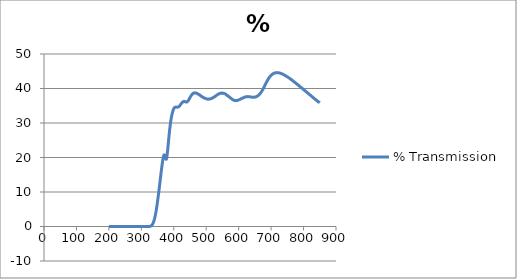
| Category | % Transmission |
|---|---|
| 850.0 | 35.874 |
| 849.0 | 35.95 |
| 848.0 | 35.981 |
| 847.0 | 36.086 |
| 846.0 | 36.12 |
| 845.0 | 36.175 |
| 844.0 | 36.282 |
| 843.0 | 36.315 |
| 842.0 | 36.426 |
| 841.0 | 36.486 |
| 840.0 | 36.576 |
| 839.0 | 36.654 |
| 838.0 | 36.695 |
| 837.0 | 36.776 |
| 836.0 | 36.86 |
| 835.0 | 36.948 |
| 834.0 | 37.019 |
| 833.0 | 37.098 |
| 832.0 | 37.189 |
| 831.0 | 37.23 |
| 830.0 | 37.332 |
| 829.0 | 37.418 |
| 828.0 | 37.479 |
| 827.0 | 37.564 |
| 826.0 | 37.66 |
| 825.0 | 37.74 |
| 824.0 | 37.8 |
| 823.0 | 37.884 |
| 822.0 | 37.952 |
| 821.0 | 38.055 |
| 820.0 | 38.13 |
| 819.0 | 38.192 |
| 818.0 | 38.271 |
| 817.0 | 38.362 |
| 816.0 | 38.419 |
| 815.0 | 38.524 |
| 814.0 | 38.585 |
| 813.0 | 38.67 |
| 812.0 | 38.768 |
| 811.0 | 38.841 |
| 810.0 | 38.909 |
| 809.0 | 39.001 |
| 808.0 | 39.061 |
| 807.0 | 39.157 |
| 806.0 | 39.238 |
| 805.0 | 39.308 |
| 804.0 | 39.382 |
| 803.0 | 39.464 |
| 802.0 | 39.53 |
| 801.0 | 39.63 |
| 800.0 | 39.699 |
| 799.0 | 39.766 |
| 798.0 | 39.854 |
| 797.0 | 39.945 |
| 796.0 | 40.009 |
| 795.0 | 40.087 |
| 794.0 | 40.174 |
| 793.0 | 40.233 |
| 792.0 | 40.318 |
| 791.0 | 40.411 |
| 790.0 | 40.484 |
| 789.0 | 40.574 |
| 788.0 | 40.641 |
| 787.0 | 40.722 |
| 786.0 | 40.805 |
| 785.0 | 40.902 |
| 784.0 | 40.947 |
| 783.0 | 41.051 |
| 782.0 | 41.102 |
| 781.0 | 41.165 |
| 780.0 | 41.261 |
| 779.0 | 41.338 |
| 778.0 | 41.39 |
| 777.0 | 41.478 |
| 776.0 | 41.555 |
| 775.0 | 41.637 |
| 774.0 | 41.717 |
| 773.0 | 41.801 |
| 772.0 | 41.861 |
| 771.0 | 41.934 |
| 770.0 | 42.011 |
| 769.0 | 42.068 |
| 768.0 | 42.154 |
| 767.0 | 42.25 |
| 766.0 | 42.311 |
| 765.0 | 42.392 |
| 764.0 | 42.456 |
| 763.0 | 42.514 |
| 762.0 | 42.607 |
| 761.0 | 42.675 |
| 760.0 | 42.717 |
| 759.0 | 42.796 |
| 758.0 | 42.876 |
| 757.0 | 42.935 |
| 756.0 | 43.003 |
| 755.0 | 43.088 |
| 754.0 | 43.14 |
| 753.0 | 43.21 |
| 752.0 | 43.266 |
| 751.0 | 43.323 |
| 750.0 | 43.392 |
| 749.0 | 43.445 |
| 748.0 | 43.489 |
| 747.0 | 43.57 |
| 746.0 | 43.613 |
| 745.0 | 43.669 |
| 744.0 | 43.739 |
| 743.0 | 43.798 |
| 742.0 | 43.831 |
| 741.0 | 43.902 |
| 740.0 | 43.94 |
| 739.0 | 43.985 |
| 738.0 | 44.049 |
| 737.0 | 44.095 |
| 736.0 | 44.122 |
| 735.0 | 44.183 |
| 734.0 | 44.227 |
| 733.0 | 44.26 |
| 732.0 | 44.301 |
| 731.0 | 44.333 |
| 730.0 | 44.358 |
| 729.0 | 44.408 |
| 728.0 | 44.44 |
| 727.0 | 44.469 |
| 726.0 | 44.494 |
| 725.0 | 44.53 |
| 724.0 | 44.528 |
| 723.0 | 44.559 |
| 722.0 | 44.575 |
| 721.0 | 44.567 |
| 720.0 | 44.579 |
| 719.0 | 44.578 |
| 718.0 | 44.581 |
| 717.0 | 44.59 |
| 716.0 | 44.599 |
| 715.0 | 44.571 |
| 714.0 | 44.567 |
| 713.0 | 44.536 |
| 712.0 | 44.517 |
| 711.0 | 44.492 |
| 710.0 | 44.474 |
| 709.0 | 44.431 |
| 708.0 | 44.381 |
| 707.0 | 44.329 |
| 706.0 | 44.258 |
| 705.0 | 44.225 |
| 704.0 | 44.155 |
| 703.0 | 44.074 |
| 702.0 | 44.008 |
| 701.0 | 43.913 |
| 700.0 | 43.823 |
| 699.0 | 43.741 |
| 698.0 | 43.64 |
| 697.0 | 43.533 |
| 696.0 | 43.415 |
| 695.0 | 43.291 |
| 694.0 | 43.146 |
| 693.0 | 43.017 |
| 692.0 | 42.863 |
| 691.0 | 42.691 |
| 690.0 | 42.554 |
| 689.0 | 42.387 |
| 688.0 | 42.214 |
| 687.0 | 42.028 |
| 686.0 | 41.874 |
| 685.0 | 41.71 |
| 684.0 | 41.513 |
| 683.0 | 41.329 |
| 682.0 | 41.122 |
| 681.0 | 40.927 |
| 680.0 | 40.754 |
| 679.0 | 40.573 |
| 678.0 | 40.368 |
| 677.0 | 40.19 |
| 676.0 | 39.995 |
| 675.0 | 39.812 |
| 674.0 | 39.656 |
| 673.0 | 39.501 |
| 672.0 | 39.333 |
| 671.0 | 39.174 |
| 670.0 | 39.02 |
| 669.0 | 38.882 |
| 668.0 | 38.774 |
| 667.0 | 38.635 |
| 666.0 | 38.509 |
| 665.0 | 38.403 |
| 664.0 | 38.286 |
| 663.0 | 38.194 |
| 662.0 | 38.122 |
| 661.0 | 38.045 |
| 660.0 | 37.965 |
| 659.0 | 37.905 |
| 658.0 | 37.829 |
| 657.0 | 37.764 |
| 656.0 | 37.724 |
| 655.0 | 37.673 |
| 654.0 | 37.621 |
| 653.0 | 37.59 |
| 652.0 | 37.558 |
| 651.0 | 37.534 |
| 650.0 | 37.529 |
| 649.0 | 37.508 |
| 648.0 | 37.484 |
| 647.0 | 37.481 |
| 646.0 | 37.47 |
| 645.0 | 37.473 |
| 644.0 | 37.488 |
| 643.0 | 37.486 |
| 642.0 | 37.473 |
| 641.0 | 37.494 |
| 640.0 | 37.506 |
| 639.0 | 37.528 |
| 638.0 | 37.56 |
| 637.0 | 37.556 |
| 636.0 | 37.561 |
| 635.0 | 37.581 |
| 634.0 | 37.584 |
| 633.0 | 37.596 |
| 632.0 | 37.624 |
| 631.0 | 37.635 |
| 630.0 | 37.64 |
| 629.0 | 37.646 |
| 628.0 | 37.636 |
| 627.0 | 37.639 |
| 626.0 | 37.65 |
| 625.0 | 37.629 |
| 624.0 | 37.614 |
| 623.0 | 37.605 |
| 622.0 | 37.575 |
| 621.0 | 37.558 |
| 620.0 | 37.541 |
| 619.0 | 37.505 |
| 618.0 | 37.465 |
| 617.0 | 37.435 |
| 616.0 | 37.381 |
| 615.0 | 37.341 |
| 614.0 | 37.306 |
| 613.0 | 37.257 |
| 612.0 | 37.212 |
| 611.0 | 37.175 |
| 610.0 | 37.121 |
| 609.0 | 37.064 |
| 608.0 | 37.035 |
| 607.0 | 36.989 |
| 606.0 | 36.936 |
| 605.0 | 36.889 |
| 604.0 | 36.836 |
| 603.0 | 36.795 |
| 602.0 | 36.776 |
| 601.0 | 36.724 |
| 600.0 | 36.683 |
| 599.0 | 36.646 |
| 598.0 | 36.605 |
| 597.0 | 36.584 |
| 596.0 | 36.557 |
| 595.0 | 36.523 |
| 594.0 | 36.504 |
| 593.0 | 36.493 |
| 592.0 | 36.485 |
| 591.0 | 36.477 |
| 590.0 | 36.508 |
| 589.0 | 36.507 |
| 588.0 | 36.517 |
| 587.0 | 36.556 |
| 586.0 | 36.572 |
| 585.0 | 36.622 |
| 584.0 | 36.669 |
| 583.0 | 36.704 |
| 582.0 | 36.759 |
| 581.0 | 36.821 |
| 580.0 | 36.879 |
| 579.0 | 36.95 |
| 578.0 | 37.03 |
| 577.0 | 37.087 |
| 576.0 | 37.165 |
| 575.0 | 37.242 |
| 574.0 | 37.315 |
| 573.0 | 37.39 |
| 572.0 | 37.477 |
| 571.0 | 37.546 |
| 570.0 | 37.609 |
| 569.0 | 37.698 |
| 568.0 | 37.768 |
| 567.0 | 37.84 |
| 566.0 | 37.936 |
| 565.0 | 37.984 |
| 564.0 | 38.059 |
| 563.0 | 38.128 |
| 562.0 | 38.171 |
| 561.0 | 38.286 |
| 560.0 | 38.331 |
| 559.0 | 38.395 |
| 558.0 | 38.456 |
| 557.0 | 38.492 |
| 556.0 | 38.534 |
| 555.0 | 38.56 |
| 554.0 | 38.572 |
| 553.0 | 38.608 |
| 552.0 | 38.635 |
| 551.0 | 38.639 |
| 550.0 | 38.657 |
| 549.0 | 38.669 |
| 548.0 | 38.651 |
| 547.0 | 38.647 |
| 546.0 | 38.671 |
| 545.0 | 38.626 |
| 544.0 | 38.609 |
| 543.0 | 38.586 |
| 542.0 | 38.525 |
| 541.0 | 38.512 |
| 540.0 | 38.482 |
| 539.0 | 38.444 |
| 538.0 | 38.391 |
| 537.0 | 38.341 |
| 536.0 | 38.275 |
| 535.0 | 38.216 |
| 534.0 | 38.172 |
| 533.0 | 38.109 |
| 532.0 | 38.037 |
| 531.0 | 37.968 |
| 530.0 | 37.886 |
| 529.0 | 37.811 |
| 528.0 | 37.782 |
| 527.0 | 37.69 |
| 526.0 | 37.643 |
| 525.0 | 37.573 |
| 524.0 | 37.492 |
| 523.0 | 37.45 |
| 522.0 | 37.401 |
| 521.0 | 37.345 |
| 520.0 | 37.289 |
| 519.0 | 37.253 |
| 518.0 | 37.181 |
| 517.0 | 37.153 |
| 516.0 | 37.124 |
| 515.0 | 37.069 |
| 514.0 | 37.051 |
| 513.0 | 37.004 |
| 512.0 | 36.975 |
| 511.0 | 36.943 |
| 510.0 | 36.964 |
| 509.0 | 36.932 |
| 508.0 | 36.926 |
| 507.0 | 36.911 |
| 506.0 | 36.906 |
| 505.0 | 36.95 |
| 504.0 | 36.976 |
| 503.0 | 36.941 |
| 502.0 | 36.976 |
| 501.0 | 36.987 |
| 500.0 | 37.005 |
| 499.0 | 37.047 |
| 498.0 | 37.118 |
| 497.0 | 37.126 |
| 496.0 | 37.185 |
| 495.0 | 37.218 |
| 494.0 | 37.232 |
| 493.0 | 37.305 |
| 492.0 | 37.358 |
| 491.0 | 37.394 |
| 490.0 | 37.468 |
| 489.0 | 37.502 |
| 488.0 | 37.56 |
| 487.0 | 37.628 |
| 486.0 | 37.702 |
| 485.0 | 37.745 |
| 484.0 | 37.826 |
| 483.0 | 37.88 |
| 482.0 | 37.947 |
| 481.0 | 38 |
| 480.0 | 38.108 |
| 479.0 | 38.143 |
| 478.0 | 38.214 |
| 477.0 | 38.291 |
| 476.0 | 38.297 |
| 475.0 | 38.38 |
| 474.0 | 38.447 |
| 473.0 | 38.496 |
| 472.0 | 38.544 |
| 471.0 | 38.574 |
| 470.0 | 38.605 |
| 469.0 | 38.648 |
| 468.0 | 38.709 |
| 467.0 | 38.69 |
| 466.0 | 38.736 |
| 465.0 | 38.716 |
| 464.0 | 38.699 |
| 463.0 | 38.706 |
| 462.0 | 38.7 |
| 461.0 | 38.658 |
| 460.0 | 38.588 |
| 459.0 | 38.557 |
| 458.0 | 38.432 |
| 457.0 | 38.362 |
| 456.0 | 38.266 |
| 455.0 | 38.125 |
| 454.0 | 38.006 |
| 453.0 | 37.865 |
| 452.0 | 37.693 |
| 451.0 | 37.544 |
| 450.0 | 37.385 |
| 449.0 | 37.213 |
| 448.0 | 37.021 |
| 447.0 | 36.874 |
| 446.0 | 36.666 |
| 445.0 | 36.544 |
| 444.0 | 36.408 |
| 443.0 | 36.297 |
| 442.0 | 36.195 |
| 441.0 | 36.13 |
| 440.0 | 36.072 |
| 439.0 | 36.051 |
| 438.0 | 36.099 |
| 437.0 | 36.088 |
| 436.0 | 36.157 |
| 435.0 | 36.181 |
| 434.0 | 36.215 |
| 433.0 | 36.252 |
| 432.0 | 36.28 |
| 431.0 | 36.225 |
| 430.0 | 36.232 |
| 429.0 | 36.188 |
| 428.0 | 36.106 |
| 427.0 | 36.04 |
| 426.0 | 35.958 |
| 425.0 | 35.826 |
| 424.0 | 35.717 |
| 423.0 | 35.601 |
| 422.0 | 35.459 |
| 421.0 | 35.35 |
| 420.0 | 35.225 |
| 419.0 | 35.098 |
| 418.0 | 34.976 |
| 417.0 | 34.883 |
| 416.0 | 34.789 |
| 415.0 | 34.712 |
| 414.0 | 34.688 |
| 413.0 | 34.606 |
| 412.0 | 34.591 |
| 411.0 | 34.582 |
| 410.0 | 34.56 |
| 409.0 | 34.6 |
| 408.0 | 34.606 |
| 407.0 | 34.612 |
| 406.0 | 34.604 |
| 405.0 | 34.594 |
| 404.0 | 34.571 |
| 403.0 | 34.521 |
| 402.0 | 34.45 |
| 401.0 | 34.303 |
| 400.0 | 34.153 |
| 399.0 | 33.955 |
| 398.0 | 33.691 |
| 397.0 | 33.41 |
| 396.0 | 33.083 |
| 395.0 | 32.682 |
| 394.0 | 32.27 |
| 393.0 | 31.797 |
| 392.0 | 31.281 |
| 391.0 | 30.707 |
| 390.0 | 30.067 |
| 389.0 | 29.356 |
| 388.0 | 28.584 |
| 387.0 | 27.758 |
| 386.0 | 26.849 |
| 385.0 | 25.924 |
| 384.0 | 24.956 |
| 383.0 | 23.953 |
| 382.0 | 22.978 |
| 381.0 | 22.021 |
| 380.0 | 21.16 |
| 379.0 | 20.416 |
| 378.0 | 19.801 |
| 377.0 | 19.534 |
| 376.0 | 19.514 |
| 375.0 | 19.7 |
| 374.0 | 20.006 |
| 373.0 | 20.344 |
| 372.0 | 20.611 |
| 371.0 | 20.747 |
| 370.0 | 20.725 |
| 369.0 | 20.535 |
| 368.0 | 20.175 |
| 367.0 | 19.708 |
| 366.0 | 19.144 |
| 365.0 | 18.508 |
| 364.0 | 17.848 |
| 363.0 | 17.155 |
| 362.0 | 16.418 |
| 361.0 | 15.672 |
| 360.0 | 14.891 |
| 359.0 | 14.097 |
| 358.0 | 13.301 |
| 357.0 | 12.518 |
| 356.0 | 11.722 |
| 355.0 | 10.949 |
| 354.0 | 10.194 |
| 353.0 | 9.447 |
| 352.0 | 8.717 |
| 351.0 | 8.011 |
| 350.0 | 7.31 |
| 349.0 | 6.627 |
| 348.0 | 5.968 |
| 347.0 | 5.335 |
| 346.0 | 4.744 |
| 345.0 | 4.199 |
| 344.0 | 3.684 |
| 343.0 | 3.213 |
| 342.0 | 2.776 |
| 341.0 | 2.372 |
| 340.0 | 2.004 |
| 339.0 | 1.675 |
| 338.0 | 1.379 |
| 337.0 | 1.12 |
| 336.0 | 0.9 |
| 335.0 | 0.712 |
| 334.0 | 0.556 |
| 333.0 | 0.431 |
| 332.0 | 0.327 |
| 331.0 | 0.244 |
| 330.0 | 0.177 |
| 329.0 | 0.123 |
| 328.0 | 0.083 |
| 327.0 | 0.058 |
| 326.0 | 0.04 |
| 325.0 | 0.027 |
| 324.0 | 0.017 |
| 323.0 | 0.008 |
| 322.0 | 0.004 |
| 321.0 | 0.004 |
| 320.0 | 0.003 |
| 319.0 | 0.003 |
| 318.0 | 0.003 |
| 317.0 | 0.002 |
| 316.0 | 0 |
| 315.0 | 0 |
| 314.0 | 0.003 |
| 313.0 | 0 |
| 312.0 | 0.003 |
| 311.0 | 0.001 |
| 310.0 | 0 |
| 309.0 | 0 |
| 308.0 | 0.002 |
| 307.0 | 0 |
| 306.0 | 0.003 |
| 305.0 | 0.002 |
| 304.0 | 0.001 |
| 303.0 | 0.001 |
| 302.0 | 0.001 |
| 301.0 | 0.001 |
| 300.0 | 0.003 |
| 299.0 | 0.001 |
| 298.0 | -0.001 |
| 297.0 | 0 |
| 296.0 | 0.001 |
| 295.0 | 0.001 |
| 294.0 | 0.003 |
| 293.0 | 0.002 |
| 292.0 | 0 |
| 291.0 | 0.002 |
| 290.0 | 0.002 |
| 289.0 | 0.002 |
| 288.0 | 0.003 |
| 287.0 | 0.001 |
| 286.0 | -0.001 |
| 285.0 | 0 |
| 284.0 | 0.001 |
| 283.0 | 0.001 |
| 282.0 | 0.002 |
| 281.0 | 0 |
| 280.0 | -0.001 |
| 279.0 | 0 |
| 278.0 | 0.001 |
| 277.0 | 0.001 |
| 276.0 | 0.003 |
| 275.0 | 0.002 |
| 274.0 | 0 |
| 273.0 | 0.002 |
| 272.0 | 0.002 |
| 271.0 | 0.003 |
| 270.0 | 0.004 |
| 269.0 | 0.002 |
| 268.0 | 0 |
| 267.0 | 0.001 |
| 266.0 | 0.002 |
| 265.0 | 0.003 |
| 264.0 | 0.003 |
| 263.0 | 0.001 |
| 262.0 | 0.001 |
| 261.0 | 0.002 |
| 260.0 | 0.001 |
| 259.0 | 0.002 |
| 258.0 | 0.003 |
| 257.0 | 0 |
| 256.0 | 0 |
| 255.0 | 0.001 |
| 254.0 | 0.002 |
| 253.0 | 0.003 |
| 252.0 | 0.004 |
| 251.0 | 0.003 |
| 250.0 | 0.001 |
| 249.0 | 0.002 |
| 248.0 | 0.002 |
| 247.0 | 0.002 |
| 246.0 | 0.004 |
| 245.0 | 0.001 |
| 244.0 | -0.001 |
| 243.0 | 0.001 |
| 242.0 | 0.001 |
| 241.0 | 0.002 |
| 240.0 | 0.004 |
| 239.0 | 0.001 |
| 238.0 | 0 |
| 237.0 | 0.002 |
| 236.0 | 0.003 |
| 235.0 | 0.003 |
| 234.0 | 0.003 |
| 233.0 | 0.002 |
| 232.0 | 0.001 |
| 231.0 | 0.002 |
| 230.0 | 0.001 |
| 229.0 | 0.002 |
| 228.0 | 0.004 |
| 227.0 | 0.004 |
| 226.0 | 0 |
| 225.0 | 0.001 |
| 224.0 | 0.002 |
| 223.0 | 0.003 |
| 222.0 | 0.004 |
| 221.0 | 0.003 |
| 220.0 | 0.001 |
| 219.0 | 0.002 |
| 218.0 | 0.002 |
| 217.0 | 0.003 |
| 216.0 | 0.004 |
| 215.0 | 0.002 |
| 214.0 | 0.001 |
| 213.0 | 0.003 |
| 212.0 | 0.003 |
| 211.0 | 0.004 |
| 210.0 | 0.004 |
| 209.0 | 0.002 |
| 208.0 | -0.001 |
| 207.0 | 0.003 |
| 206.0 | 0.003 |
| 205.0 | 0.003 |
| 204.0 | 0.005 |
| 203.0 | 0.003 |
| 202.0 | 0.001 |
| 201.0 | 0.003 |
| 200.0 | 0.003 |